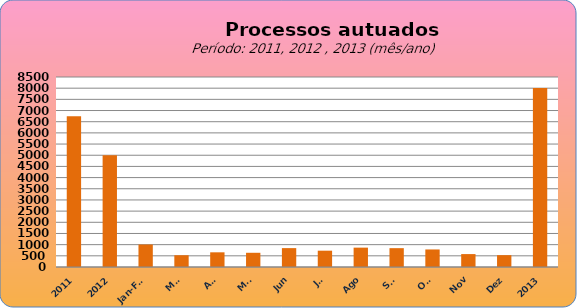
| Category | 6749 4998 1006 527 657 636 845 730 866 843 785 578 530 |
|---|---|
| 2011 | 6749 |
| 2012 | 4998 |
| Jan-Fev | 1006 |
| Mar | 527 |
| Abr | 657 |
| Mai | 636 |
| Jun | 845 |
| Jul | 730 |
| Ago | 866 |
| Set | 843 |
| Out | 785 |
| Nov | 578 |
| Dez | 530 |
| 2013 | 8003 |